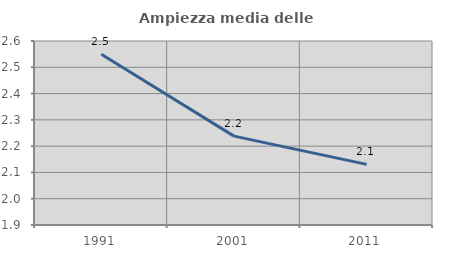
| Category | Ampiezza media delle famiglie |
|---|---|
| 1991.0 | 2.549 |
| 2001.0 | 2.238 |
| 2011.0 | 2.131 |